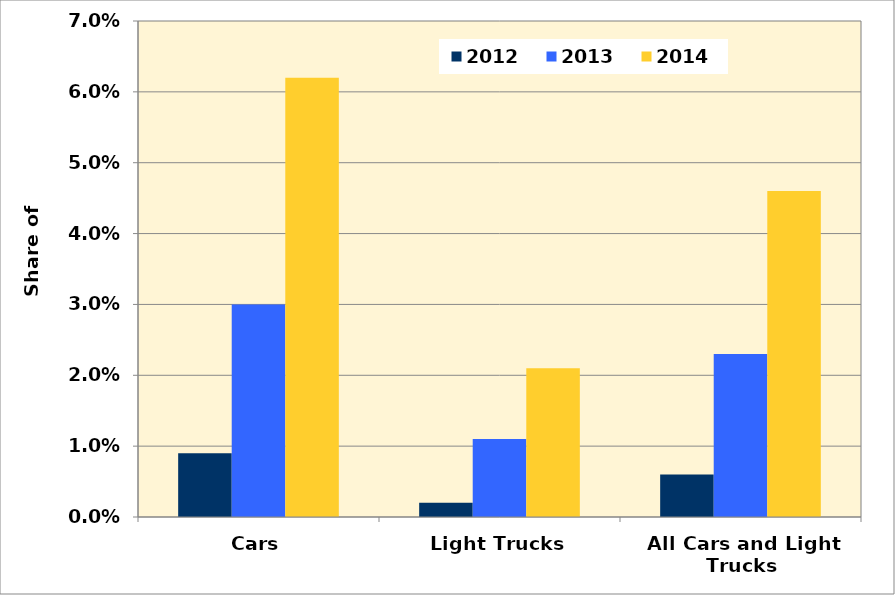
| Category | 2012 | 2013 | 2014 |
|---|---|---|---|
| Cars | 0.009 | 0.03 | 0.062 |
| Light Trucks | 0.002 | 0.011 | 0.021 |
| All Cars and Light Trucks | 0.006 | 0.023 | 0.046 |